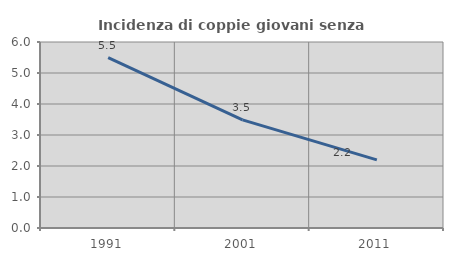
| Category | Incidenza di coppie giovani senza figli |
|---|---|
| 1991.0 | 5.495 |
| 2001.0 | 3.488 |
| 2011.0 | 2.198 |